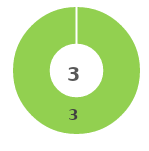
| Category | Series 0 |
|---|---|
| 0 | 0 |
| 1 | 3 |
| 2 | 0 |
| 3 | 0 |
| 4 | 0 |